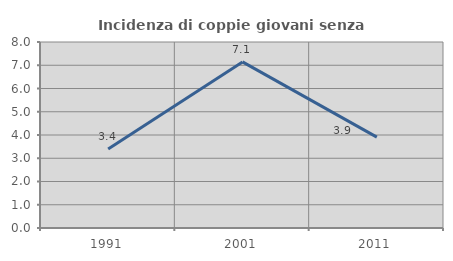
| Category | Incidenza di coppie giovani senza figli |
|---|---|
| 1991.0 | 3.401 |
| 2001.0 | 7.143 |
| 2011.0 | 3.906 |